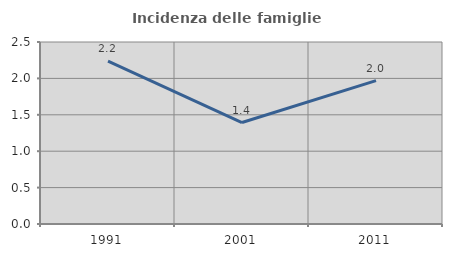
| Category | Incidenza delle famiglie numerose |
|---|---|
| 1991.0 | 2.238 |
| 2001.0 | 1.394 |
| 2011.0 | 1.969 |